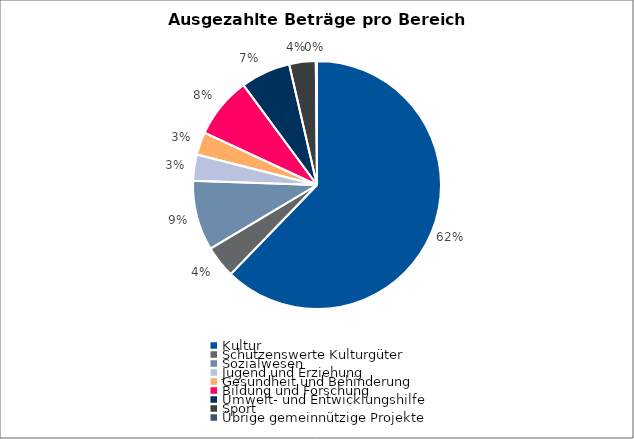
| Category | Series 0 |
|---|---|
| Kultur | 2116291.66 |
| Schützenswerte Kulturgüter | 142861.95 |
| Sozialwesen | 309083.18 |
| Jugend und Erziehung | 116858 |
| Gesundheit und Behinderung | 100675 |
| Bildung und Forschung | 270899.18 |
| Umwelt- und Entwicklungshilfe | 221000 |
| Sport | 117350 |
| Übrige gemeinnützige Projekte | 5250 |